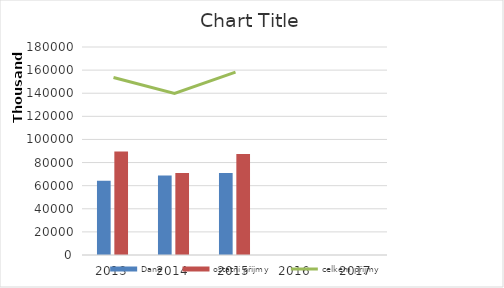
| Category | Daně | ostatní příjmy |
|---|---|---|
| 2013.0 | 64168276 | 89472981 |
| 2014.0 | 68876667 | 70930301 |
| 2015.0 | 70886189 | 87313297 |
| 2016.0 | 0 | 0 |
| 2017.0 | 0 | 0 |